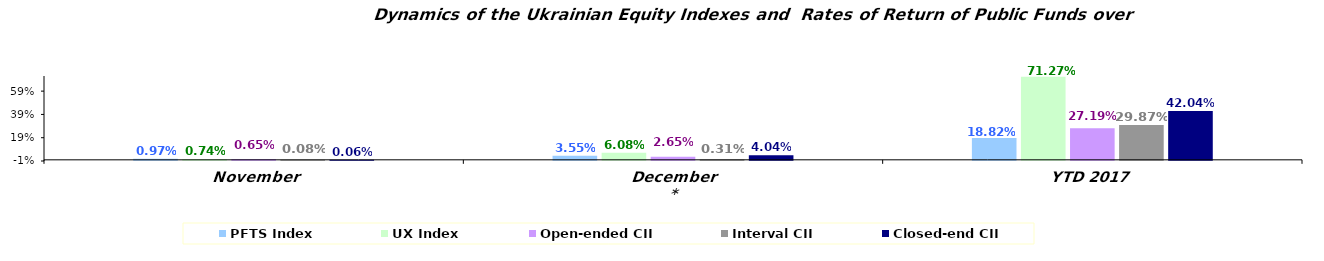
| Category | PFTS Index | UX Index | Open-ended CII | Interval CII | Closed-end CII |
|---|---|---|---|---|---|
| November | 0.01 | 0.007 | 0.006 | 0.001 | 0.001 |
| December* | 0.035 | 0.061 | 0.027 | 0.003 | 0.04 |
| YTD 2017 | 0.188 | 0.713 | 0.272 | 0.299 | 0.42 |